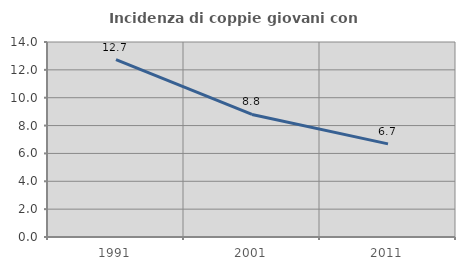
| Category | Incidenza di coppie giovani con figli |
|---|---|
| 1991.0 | 12.738 |
| 2001.0 | 8.797 |
| 2011.0 | 6.684 |